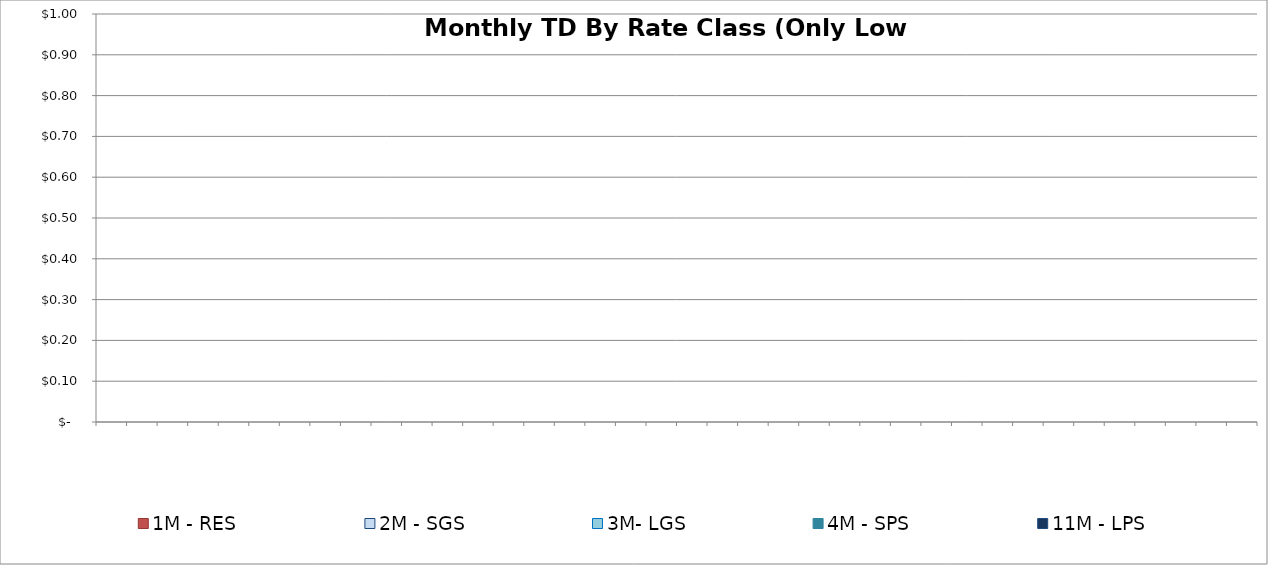
| Category | 11M - LPS | 4M - SPS | 3M- LGS | 2M - SGS | 1M - RES |
|---|---|---|---|---|---|
| 0 | 0 | 0 | 0 | 0 | 0 |
| 1900-01-01 | 0 | 0 | 0 | 0 | 0 |
| 1900-01-02 | 0 | 0 | 0 | 0 | 0 |
| 1900-01-03 | 0 | 0 | 0 | 0 | 0 |
| 1900-01-04 | 0 | 0 | 0 | 0 | 0 |
| 1900-01-05 | 0 | 0 | 0 | 0 | 0 |
| 1900-01-06 | 0 | 0 | 0 | 0 | 0 |
| 1900-01-07 | 0 | 0 | 0 | 0 | 0 |
| 1900-01-08 | 0 | 0 | 0 | 0 | 0 |
| 1900-01-09 | 0 | 0 | 0 | 0 | 0 |
| 1900-01-10 | 0 | 0 | 0 | 0 | 0 |
| 1900-01-11 | 0 | 0 | 0 | 0 | 0 |
| 1900-01-12 | 0 | 0 | 0 | 0 | 0 |
| 1900-01-13 | 0 | 0 | 0 | 0 | 0 |
| 1900-01-14 | 0 | 0 | 0 | 0 | 0 |
| 1900-01-15 | 0 | 0 | 0 | 0 | 0 |
| 1900-01-16 | 0 | 0 | 0 | 0 | 0 |
| 1900-01-17 | 0 | 0 | 0 | 0 | 0 |
| 1900-01-18 | 0 | 0 | 0 | 0 | 0 |
| 1900-01-19 | 0 | 0 | 0 | 0 | 0 |
| 1900-01-20 | 0 | 0 | 0 | 0 | 0 |
| 1900-01-21 | 0 | 0 | 0 | 0 | 0 |
| 1900-01-22 | 0 | 0 | 0 | 0 | 0 |
| 1900-01-23 | 0 | 0 | 0 | 0 | 0 |
| 1900-01-24 | 0 | 0 | 0 | 0 | 0 |
| 1900-01-25 | 0 | 0 | 0 | 0 | 0 |
| 1900-01-26 | 0 | 0 | 0 | 0 | 0 |
| 1900-01-27 | 0 | 0 | 0 | 0 | 0 |
| 1900-01-28 | 0 | 0 | 0 | 0 | 0 |
| 1900-01-29 | 0 | 0 | 0 | 0 | 0 |
| 1900-01-30 | 0 | 0 | 0 | 0 | 0 |
| 1900-01-31 | 0 | 0 | 0 | 0 | 0 |
| 1900-02-01 | 0 | 0 | 0 | 0 | 0 |
| 1900-02-02 | 0 | 0 | 0 | 0 | 0 |
| 1900-02-03 | 0 | 0 | 0 | 0 | 0 |
| 1900-02-04 | 0 | 0 | 0 | 0 | 0 |
| 1900-02-05 | 0 | 0 | 0 | 0 | 0 |
| 1900-02-06 | 0 | 0 | 0 | 0 | 0 |